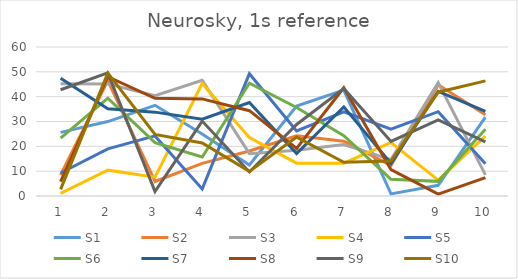
| Category | S1 | S2 | S3 | S4 | S5 | S6 | S7 | S8 | S9 | S10 |
|---|---|---|---|---|---|---|---|---|---|---|
| 1.0 | 25.61 | 8.47 | 45.25 | 1.06 | 9.25 | 23.29 | 47.42 | 5.82 | 42.79 | 2.67 |
| 2.0 | 29.97 | 46.46 | 45.14 | 10.4 | 18.96 | 39.38 | 35.14 | 48.06 | 49.59 | 49.49 |
| 3.0 | 36.52 | 5.84 | 40.42 | 7.59 | 24.21 | 21.49 | 33.77 | 39.36 | 1.79 | 24.82 |
| 4.0 | 24.96 | 13.12 | 46.55 | 45.29 | 2.87 | 15.72 | 30.94 | 39.1 | 30.16 | 21.36 |
| 5.0 | 12.46 | 18.12 | 17.04 | 23.58 | 49.25 | 45.41 | 37.63 | 34.36 | 9.69 | 9.91 |
| 6.0 | 36.25 | 24.27 | 18.41 | 13.23 | 26.24 | 35.66 | 17.09 | 19.2 | 28.8 | 23.71 |
| 7.0 | 42.61 | 22.09 | 20.72 | 13.19 | 33.92 | 24.28 | 35.89 | 43.57 | 43.27 | 13.61 |
| 8.0 | 0.83 | 12.27 | 14.64 | 21.55 | 26.91 | 6.75 | 13.14 | 10.61 | 21.96 | 14.06 |
| 9.0 | 4.3 | 44.8 | 45.66 | 6.4 | 33.96 | 5.89 | 42.15 | 0.75 | 30.63 | 41.81 |
| 10.0 | 31.76 | 32.72 | 8.53 | 24.11 | 12.98 | 26.87 | 34.08 | 7.4 | 21.78 | 46.35 |